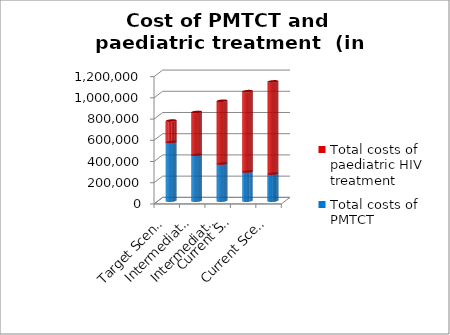
| Category | Total costs of PMTCT | Total costs of paediatric HIV treatment  |
|---|---|---|
| Target Scenario | 553506.121 | 201352.884 |
| Intermediate Scenario 2 | 432629.197 | 403604.45 |
| Intermediate Scenario 1 | 349483.964 | 592190.95 |
| Current Scenario 
with ANC data | 274937.51 | 757204.138 |
| Current Scenario without ANC data | 254864.781 | 869349.439 |